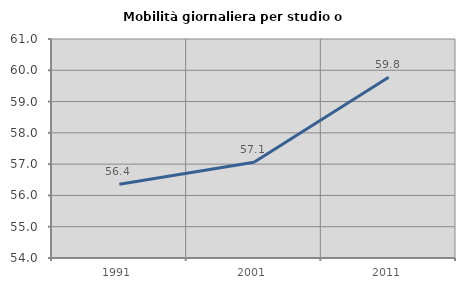
| Category | Mobilità giornaliera per studio o lavoro |
|---|---|
| 1991.0 | 56.357 |
| 2001.0 | 57.059 |
| 2011.0 | 59.778 |